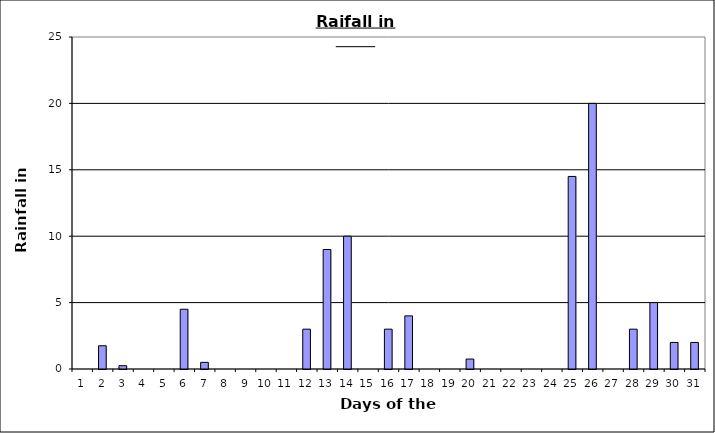
| Category | Series 0 |
|---|---|
| 0 | 0 |
| 1 | 1.75 |
| 2 | 0.25 |
| 3 | 0 |
| 4 | 0 |
| 5 | 4.5 |
| 6 | 0.5 |
| 7 | 0 |
| 8 | 0 |
| 9 | 0 |
| 10 | 0 |
| 11 | 3 |
| 12 | 9 |
| 13 | 10 |
| 14 | 0 |
| 15 | 3 |
| 16 | 4 |
| 17 | 0 |
| 18 | 0 |
| 19 | 0.75 |
| 20 | 0 |
| 21 | 0 |
| 22 | 0 |
| 23 | 0 |
| 24 | 14.5 |
| 25 | 20 |
| 26 | 0 |
| 27 | 3 |
| 28 | 5 |
| 29 | 2 |
| 30 | 2 |